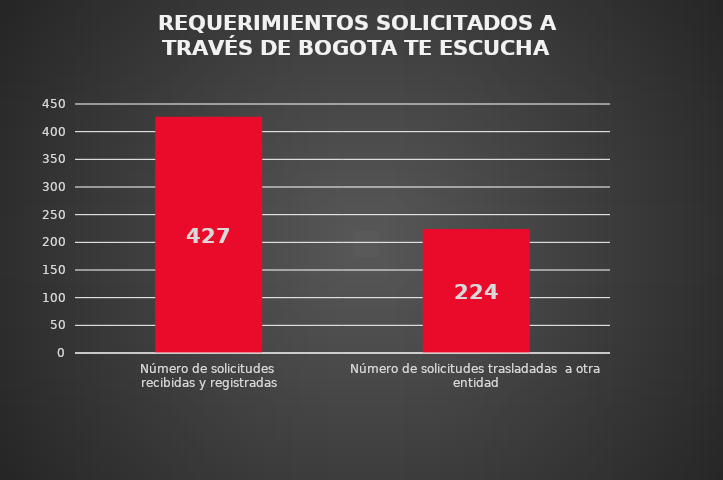
| Category | Series 0 | Series 1 |
|---|---|---|
| Número de solicitudes 
recibidas y registradas | 0 | 427 |
| Número de solicitudes trasladadas  a otra entidad | 0 | 224 |